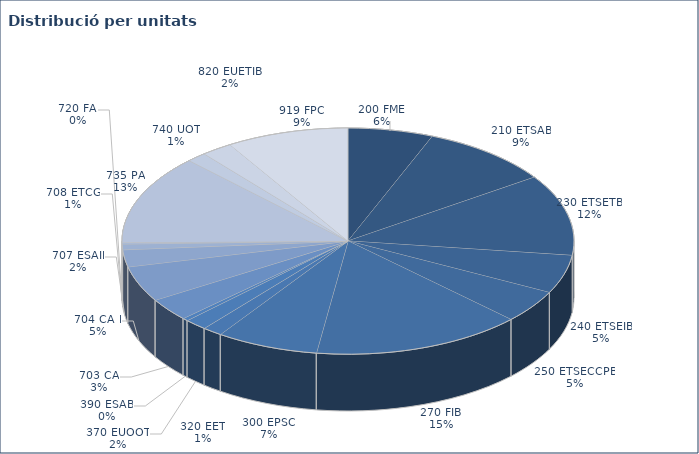
| Category | Series 0 |
|---|---|
| 200 FME | 30 |
| 210 ETSAB | 46 |
| 230 ETSETB | 57 |
| 240 ETSEIB | 27 |
| 250 ETSECCPB | 23 |
| 270 FIB | 74 |
| 300 EPSC | 36 |
| 320 EET | 7 |
| 370 EUOOT | 8 |
| 390 ESAB | 2 |
| 703 CA | 16 |
| 704 CA I | 25 |
| 707 ESAII | 12 |
| 708 ETCG | 4 |
| 720 FA | 1 |
| 735 PA | 63 |
| 740 UOT | 7 |
| 820 EUETIB | 11 |
| 919 FPC | 43 |